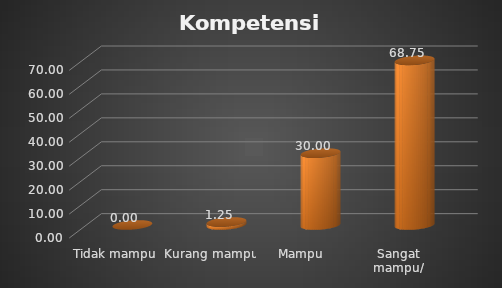
| Category | Kompetensi Petugas |
|---|---|
| Tidak mampu | 0 |
| Kurang mampu   | 1.25 |
| Mampu  | 30 |
| Sangat mampu/ terampil | 68.75 |